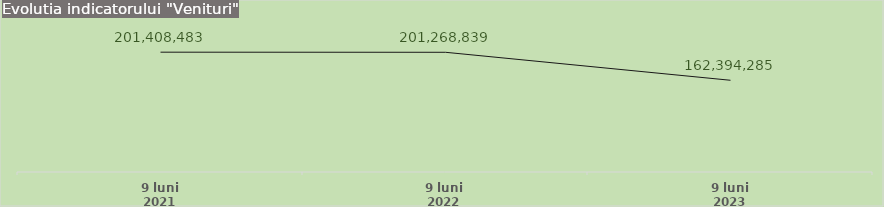
| Category | Series 1 |
|---|---|
| 9 luni 2021 | 201408483 |
| 9 luni 2022 | 201268839 |
| 9 luni 2023 | 162394285 |